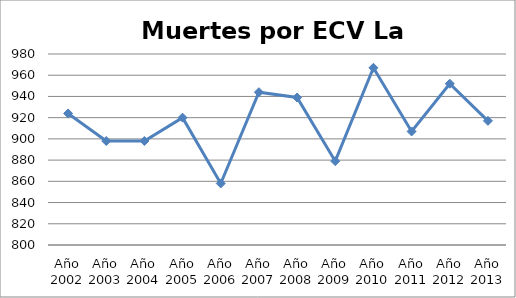
| Category | Series 0 |
|---|---|
| Año 2002 | 924 |
| Año 2003 | 898 |
| Año 2004 | 898 |
| Año 2005 | 920 |
| Año 2006 | 858 |
| Año 2007 | 944 |
| Año 2008 | 939 |
| Año 2009 | 879 |
| Año 2010 | 967 |
| Año 2011 | 907 |
| Año 2012 | 952 |
| Año 2013 | 917 |